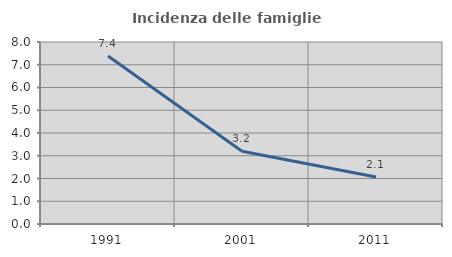
| Category | Incidenza delle famiglie numerose |
|---|---|
| 1991.0 | 7.385 |
| 2001.0 | 3.199 |
| 2011.0 | 2.067 |